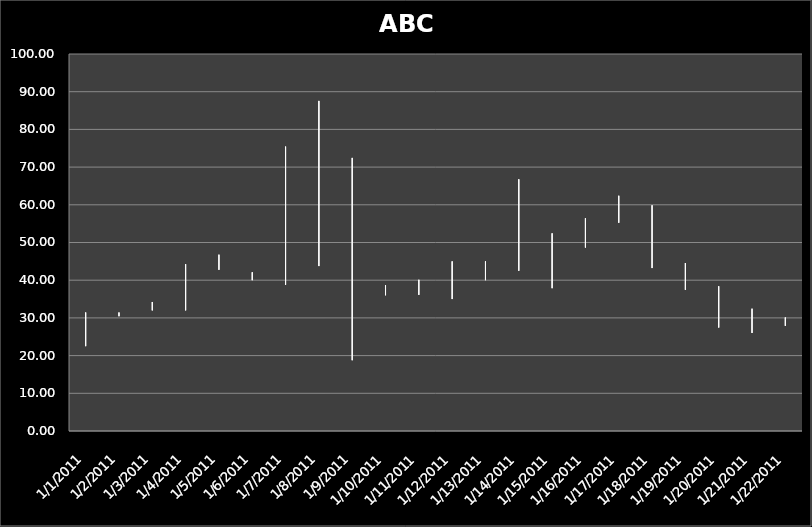
| Category | High Price | Low Price | Closing Price |
|---|---|---|---|
| 1/1/11 | 31.44 | 22.5 | 30.79 |
| 1/2/11 | 30.44 | 31.44 | 30.89 |
| 1/3/11 | 34.22 | 32.11 | 31.99 |
| 1/4/11 | 44.25 | 31.99 | 44 |
| 1/5/11 | 46.77 | 44 | 42.75 |
| 1/6/11 | 42.11 | 40 | 42 |
| 1/7/11 | 75.44 | 38.77 | 43.75 |
| 1/8/11 | 87.56 | 43.75 | 72.44 |
| 1/9/11 | 72.44 | 18.77 | 37.66 |
| 1/10/11 | 38.66 | 36 | 36.17 |
| 1/11/11 | 40.11 | 36.11 | 37.45 |
| 1/12/11 | 45 | 35 | 40 |
| 1/13/11 | 45 | 40 | 42.5 |
| 1/14/11 | 66.77 | 42.5 | 52.44 |
| 1/15/11 | 52.44 | 37.88 | 48.66 |
| 1/16/11 | 56.44 | 48.66 | 55.23 |
| 1/17/11 | 62.4 | 55.23 | 59.87 |
| 1/18/11 | 59.87 | 43.22 | 44.56 |
| 1/19/11 | 44.56 | 37.44 | 38.5 |
| 1/20/11 | 38.4 | 27.44 | 29.44 |
| 1/21/11 | 32.44 | 26 | 29.01 |
| 1/22/11 | 30.12 | 28.44 | 27.89 |